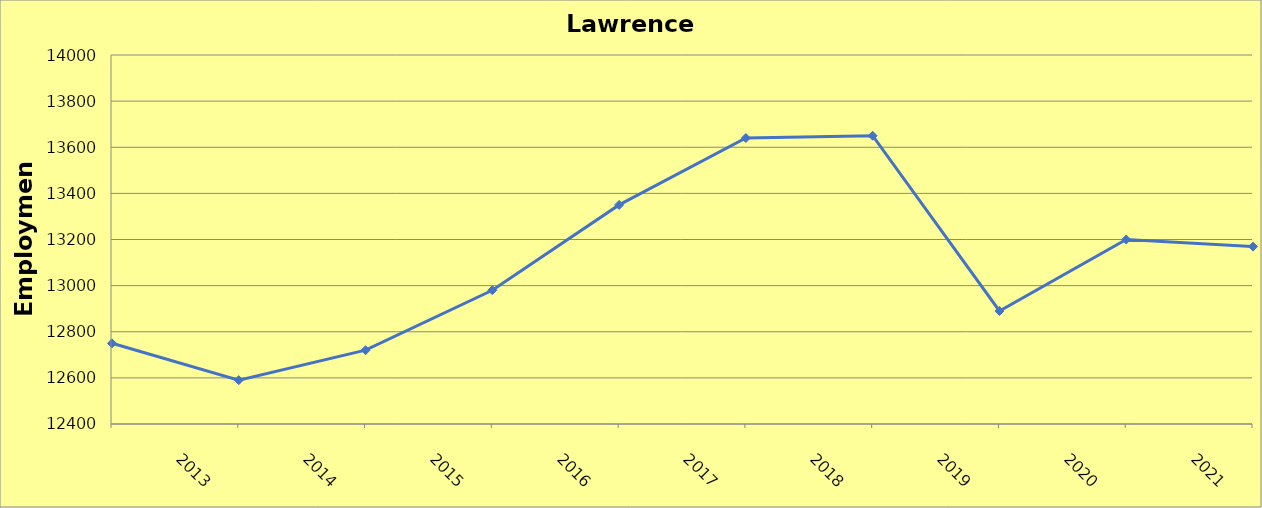
| Category | Lawrence County |
|---|---|
| 2013.0 | 12750 |
| 2014.0 | 12590 |
| 2015.0 | 12720 |
| 2016.0 | 12980 |
| 2017.0 | 13350 |
| 2018.0 | 13640 |
| 2019.0 | 13650 |
| 2020.0 | 12890 |
| 2021.0 | 13200 |
| 2022.0 | 13169 |